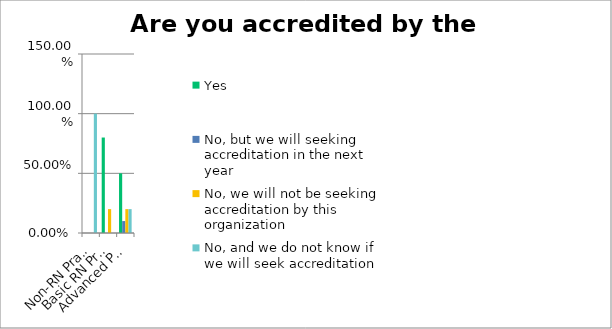
| Category | Yes | No, but we will seeking accreditation in the next year | No, we will not be seeking accreditation by this organization | No, and we do not know if we will seek accreditation |
|---|---|---|---|---|
| Non-RN Practice | 0 | 0 | 0 | 1 |
| Basic RN Practice | 0.8 | 0 | 0.2 | 0 |
| Advanced Practice | 0.5 | 0.1 | 0.2 | 0.2 |